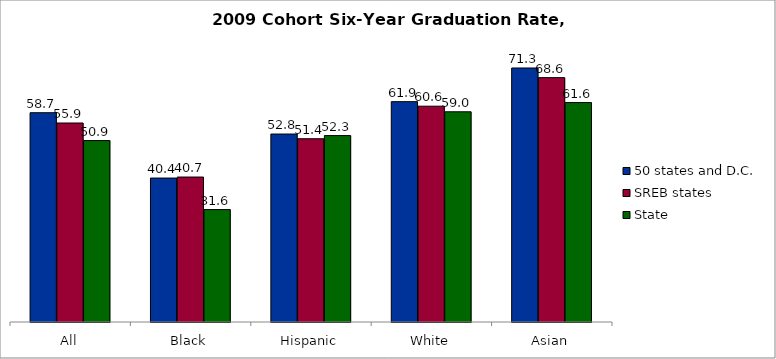
| Category | 50 states and D.C. | SREB states | State |
|---|---|---|---|
| All | 58.747 | 55.86 | 50.933 |
| Black | 40.407 | 40.69 | 31.566 |
| Hispanic | 52.76 | 51.442 | 52.323 |
| White | 61.853 | 60.577 | 59.006 |
| Asian | 71.3 | 68.594 | 61.598 |